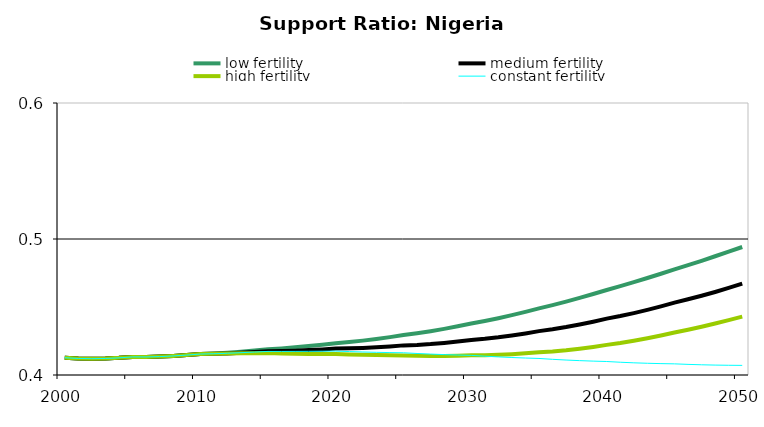
| Category | low fertility | medium fertility | high fertility | constant fertility |
|---|---|---|---|---|
| 2000.0 | 0.413 | 0.413 | 0.413 | 0.413 |
| 2001.0 | 0.412 | 0.412 | 0.412 | 0.412 |
| 2002.0 | 0.412 | 0.412 | 0.412 | 0.412 |
| 2003.0 | 0.412 | 0.412 | 0.412 | 0.412 |
| 2004.0 | 0.413 | 0.413 | 0.413 | 0.413 |
| 2005.0 | 0.413 | 0.413 | 0.413 | 0.413 |
| 2006.0 | 0.413 | 0.413 | 0.413 | 0.413 |
| 2007.0 | 0.414 | 0.414 | 0.414 | 0.414 |
| 2008.0 | 0.414 | 0.414 | 0.414 | 0.414 |
| 2009.0 | 0.415 | 0.415 | 0.415 | 0.415 |
| 2010.0 | 0.415 | 0.415 | 0.415 | 0.415 |
| 2011.0 | 0.416 | 0.416 | 0.416 | 0.416 |
| 2012.0 | 0.416 | 0.416 | 0.416 | 0.416 |
| 2013.0 | 0.417 | 0.416 | 0.416 | 0.416 |
| 2014.0 | 0.418 | 0.417 | 0.416 | 0.417 |
| 2015.0 | 0.419 | 0.418 | 0.416 | 0.417 |
| 2016.0 | 0.42 | 0.418 | 0.416 | 0.417 |
| 2017.0 | 0.42 | 0.418 | 0.416 | 0.417 |
| 2018.0 | 0.421 | 0.418 | 0.415 | 0.417 |
| 2019.0 | 0.422 | 0.419 | 0.415 | 0.417 |
| 2020.0 | 0.423 | 0.419 | 0.415 | 0.418 |
| 2021.0 | 0.424 | 0.42 | 0.415 | 0.417 |
| 2022.0 | 0.425 | 0.42 | 0.415 | 0.417 |
| 2023.0 | 0.426 | 0.42 | 0.415 | 0.417 |
| 2024.0 | 0.428 | 0.421 | 0.415 | 0.416 |
| 2025.0 | 0.429 | 0.422 | 0.414 | 0.416 |
| 2026.0 | 0.431 | 0.422 | 0.414 | 0.416 |
| 2027.0 | 0.432 | 0.423 | 0.414 | 0.415 |
| 2028.0 | 0.434 | 0.424 | 0.414 | 0.415 |
| 2029.0 | 0.436 | 0.425 | 0.414 | 0.415 |
| 2030.0 | 0.438 | 0.426 | 0.414 | 0.414 |
| 2031.0 | 0.44 | 0.427 | 0.415 | 0.414 |
| 2032.0 | 0.442 | 0.428 | 0.415 | 0.413 |
| 2033.0 | 0.444 | 0.429 | 0.415 | 0.413 |
| 2034.0 | 0.446 | 0.431 | 0.416 | 0.412 |
| 2035.0 | 0.449 | 0.432 | 0.417 | 0.412 |
| 2036.0 | 0.451 | 0.434 | 0.417 | 0.412 |
| 2037.0 | 0.454 | 0.435 | 0.418 | 0.411 |
| 2038.0 | 0.457 | 0.437 | 0.419 | 0.411 |
| 2039.0 | 0.46 | 0.439 | 0.421 | 0.41 |
| 2040.0 | 0.462 | 0.441 | 0.422 | 0.41 |
| 2041.0 | 0.465 | 0.443 | 0.424 | 0.409 |
| 2042.0 | 0.468 | 0.446 | 0.425 | 0.409 |
| 2043.0 | 0.471 | 0.448 | 0.427 | 0.409 |
| 2044.0 | 0.474 | 0.451 | 0.429 | 0.408 |
| 2045.0 | 0.478 | 0.453 | 0.431 | 0.408 |
| 2046.0 | 0.481 | 0.456 | 0.433 | 0.408 |
| 2047.0 | 0.484 | 0.458 | 0.436 | 0.408 |
| 2048.0 | 0.487 | 0.461 | 0.438 | 0.407 |
| 2049.0 | 0.491 | 0.464 | 0.44 | 0.407 |
| 2050.0 | 0.494 | 0.467 | 0.443 | 0.407 |